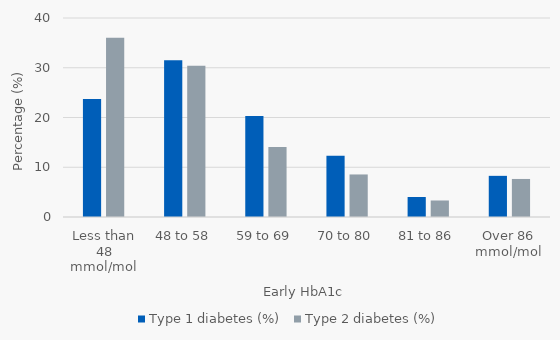
| Category | Type 1 diabetes (%) | Type 2 diabetes (%) |
|---|---|---|
| Less than 48 mmol/mol | 23.723 | 36.016 |
| 48 to 58 | 31.509 | 30.382 |
| 59 to 69 | 20.316 | 14.085 |
| 70 to 80 | 12.287 | 8.551 |
| 81 to 86 | 4.015 | 3.32 |
| Over 86 mmol/mol | 8.273 | 7.646 |